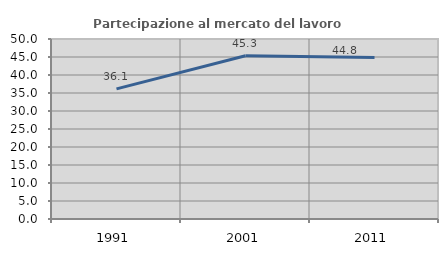
| Category | Partecipazione al mercato del lavoro  femminile |
|---|---|
| 1991.0 | 36.145 |
| 2001.0 | 45.349 |
| 2011.0 | 44.848 |